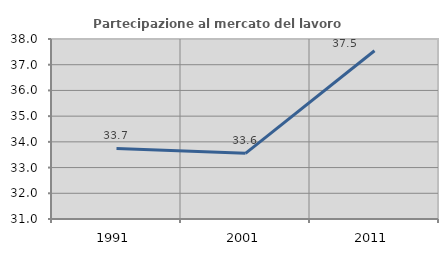
| Category | Partecipazione al mercato del lavoro  femminile |
|---|---|
| 1991.0 | 33.746 |
| 2001.0 | 33.555 |
| 2011.0 | 37.543 |